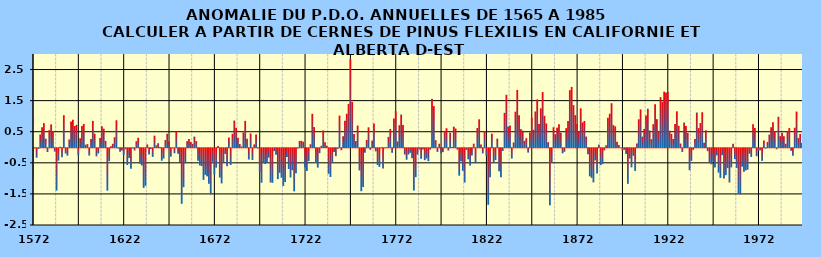
| Category | PDO |
|---|---|
| 1572.0 | -1.008 |
| 1573.0 | -0.007 |
| 1574.0 | -0.303 |
| 1575.0 | -0.023 |
| 1576.0 | 0.412 |
| 1577.0 | 0.647 |
| 1578.0 | 0.775 |
| 1579.0 | 0.276 |
| 1580.0 | -0.122 |
| 1581.0 | 0.549 |
| 1582.0 | 0.735 |
| 1583.0 | 0.515 |
| 1584.0 | -0.107 |
| 1585.0 | -1.361 |
| 1586.0 | -0.398 |
| 1587.0 | 0.017 |
| 1588.0 | -0.288 |
| 1589.0 | 1.031 |
| 1590.0 | -0.167 |
| 1591.0 | -0.238 |
| 1592.0 | 0.25 |
| 1593.0 | 0.826 |
| 1594.0 | 0.888 |
| 1595.0 | 0.685 |
| 1596.0 | 0.722 |
| 1597.0 | -0.222 |
| 1598.0 | 0.29 |
| 1599.0 | 0.682 |
| 1600.0 | 0.752 |
| 1601.0 | 0.083 |
| 1602.0 | 0.101 |
| 1603.0 | -0.235 |
| 1604.0 | 0.263 |
| 1605.0 | 0.85 |
| 1606.0 | 0.437 |
| 1607.0 | -0.259 |
| 1608.0 | -0.166 |
| 1609.0 | 0.302 |
| 1610.0 | 0.674 |
| 1611.0 | 0.599 |
| 1612.0 | 0.205 |
| 1613.0 | -1.363 |
| 1614.0 | -0.412 |
| 1615.0 | 0.032 |
| 1616.0 | 0.112 |
| 1617.0 | 0.323 |
| 1618.0 | 0.869 |
| 1619.0 | -0.014 |
| 1620.0 | -0.113 |
| 1621.0 | -0.074 |
| 1622.0 | -0.217 |
| 1623.0 | -0.03 |
| 1624.0 | -0.539 |
| 1625.0 | -0.31 |
| 1626.0 | -0.657 |
| 1627.0 | -0.009 |
| 1628.0 | -0.071 |
| 1629.0 | 0.196 |
| 1630.0 | 0.306 |
| 1631.0 | -0.501 |
| 1632.0 | -0.555 |
| 1633.0 | -1.275 |
| 1634.0 | -1.207 |
| 1635.0 | 0.092 |
| 1636.0 | -0.203 |
| 1637.0 | -0.024 |
| 1638.0 | -0.278 |
| 1639.0 | 0.375 |
| 1640.0 | 0.062 |
| 1641.0 | 0.13 |
| 1642.0 | 0.01 |
| 1643.0 | -0.402 |
| 1644.0 | -0.331 |
| 1645.0 | 0.231 |
| 1646.0 | 0.435 |
| 1647.0 | 0.192 |
| 1648.0 | -0.27 |
| 1649.0 | -0.006 |
| 1650.0 | -0.161 |
| 1651.0 | 0.496 |
| 1652.0 | -0.177 |
| 1653.0 | -0.454 |
| 1654.0 | -1.786 |
| 1655.0 | -1.252 |
| 1656.0 | -0.479 |
| 1657.0 | 0.195 |
| 1658.0 | 0.265 |
| 1659.0 | 0.171 |
| 1660.0 | 0.109 |
| 1661.0 | 0.345 |
| 1662.0 | 0.199 |
| 1663.0 | -0.403 |
| 1664.0 | -0.553 |
| 1665.0 | -0.573 |
| 1666.0 | -1.018 |
| 1667.0 | -0.854 |
| 1668.0 | -0.902 |
| 1669.0 | -1.14 |
| 1670.0 | -1.484 |
| 1671.0 | -0.435 |
| 1672.0 | -0.846 |
| 1673.0 | -0.625 |
| 1674.0 | 0.045 |
| 1675.0 | -0.942 |
| 1676.0 | -1.13 |
| 1677.0 | -0.445 |
| 1678.0 | -0.184 |
| 1679.0 | -0.577 |
| 1680.0 | 0.313 |
| 1681.0 | -0.537 |
| 1682.0 | 0.435 |
| 1683.0 | 0.86 |
| 1684.0 | 0.622 |
| 1685.0 | 0.302 |
| 1686.0 | 0.103 |
| 1687.0 | 0.025 |
| 1688.0 | 0.475 |
| 1689.0 | 0.85 |
| 1690.0 | 0.278 |
| 1691.0 | -0.362 |
| 1692.0 | 0.446 |
| 1693.0 | -0.376 |
| 1694.0 | 0.093 |
| 1695.0 | 0.411 |
| 1696.0 | -0.009 |
| 1697.0 | -0.762 |
| 1698.0 | -1.11 |
| 1699.0 | -0.443 |
| 1700.0 | -0.508 |
| 1701.0 | -0.459 |
| 1702.0 | -0.3 |
| 1703.0 | -1.099 |
| 1704.0 | -1.111 |
| 1705.0 | -0.093 |
| 1706.0 | -0.208 |
| 1707.0 | -0.991 |
| 1708.0 | -0.791 |
| 1709.0 | -0.947 |
| 1710.0 | -1.215 |
| 1711.0 | -1.085 |
| 1712.0 | -0.283 |
| 1713.0 | -0.666 |
| 1714.0 | -0.941 |
| 1715.0 | -0.707 |
| 1716.0 | -1.385 |
| 1717.0 | -0.807 |
| 1718.0 | -0.012 |
| 1719.0 | 0.205 |
| 1720.0 | 0.206 |
| 1721.0 | 0.18 |
| 1722.0 | -0.611 |
| 1723.0 | -0.732 |
| 1724.0 | -0.412 |
| 1725.0 | 0.097 |
| 1726.0 | 1.077 |
| 1727.0 | 0.65 |
| 1728.0 | -0.467 |
| 1729.0 | -0.622 |
| 1730.0 | -0.156 |
| 1731.0 | 0.05 |
| 1732.0 | 0.543 |
| 1733.0 | 0.159 |
| 1734.0 | 0.052 |
| 1735.0 | -0.821 |
| 1736.0 | -0.923 |
| 1737.0 | -0.443 |
| 1738.0 | -0.121 |
| 1739.0 | -0.254 |
| 1740.0 | -0.021 |
| 1741.0 | 1.019 |
| 1742.0 | -0.062 |
| 1743.0 | 0.355 |
| 1744.0 | 0.854 |
| 1745.0 | 1.078 |
| 1746.0 | 1.395 |
| 1747.0 | 2.832 |
| 1748.0 | 1.46 |
| 1749.0 | 0.424 |
| 1750.0 | 0.199 |
| 1751.0 | 0.7 |
| 1752.0 | -0.713 |
| 1753.0 | -1.382 |
| 1754.0 | -1.249 |
| 1755.0 | -0.143 |
| 1756.0 | 0.235 |
| 1757.0 | 0.642 |
| 1758.0 | -0.051 |
| 1759.0 | 0.217 |
| 1760.0 | 0.762 |
| 1761.0 | -0.099 |
| 1762.0 | -0.54 |
| 1763.0 | -0.601 |
| 1764.0 | -0.006 |
| 1765.0 | -0.648 |
| 1766.0 | -0.005 |
| 1767.0 | 0.004 |
| 1768.0 | 0.335 |
| 1769.0 | 0.591 |
| 1770.0 | -0.147 |
| 1771.0 | 0.927 |
| 1772.0 | 1.159 |
| 1773.0 | 0.186 |
| 1774.0 | 0.71 |
| 1775.0 | 1.054 |
| 1776.0 | 0.713 |
| 1777.0 | -0.2 |
| 1778.0 | -0.368 |
| 1779.0 | -0.203 |
| 1780.0 | -0.148 |
| 1781.0 | -0.32 |
| 1782.0 | -1.36 |
| 1783.0 | -0.926 |
| 1784.0 | -0.204 |
| 1785.0 | -0.042 |
| 1786.0 | -0.339 |
| 1787.0 | -0.04 |
| 1788.0 | -0.382 |
| 1789.0 | -0.329 |
| 1790.0 | -0.414 |
| 1791.0 | -0.044 |
| 1792.0 | 1.563 |
| 1793.0 | 1.325 |
| 1794.0 | 0.228 |
| 1795.0 | -0.117 |
| 1796.0 | 0.114 |
| 1797.0 | -0.171 |
| 1798.0 | -0.124 |
| 1799.0 | 0.527 |
| 1800.0 | 0.612 |
| 1801.0 | -0.073 |
| 1802.0 | 0.469 |
| 1803.0 | 0.007 |
| 1804.0 | 0.665 |
| 1805.0 | 0.605 |
| 1806.0 | -0.045 |
| 1807.0 | -0.882 |
| 1808.0 | -0.415 |
| 1809.0 | -0.726 |
| 1810.0 | -1.103 |
| 1811.0 | -0.052 |
| 1812.0 | -0.355 |
| 1813.0 | -0.557 |
| 1814.0 | -0.236 |
| 1815.0 | 0.116 |
| 1816.0 | -0.48 |
| 1817.0 | 0.622 |
| 1818.0 | 0.9 |
| 1819.0 | 0.09 |
| 1820.0 | -0.163 |
| 1821.0 | 0.523 |
| 1822.0 | -0.237 |
| 1823.0 | -1.818 |
| 1824.0 | -0.931 |
| 1825.0 | 0.437 |
| 1826.0 | -0.449 |
| 1827.0 | -0.379 |
| 1828.0 | 0.279 |
| 1829.0 | -0.741 |
| 1830.0 | -0.935 |
| 1831.0 | -0.087 |
| 1832.0 | 1.108 |
| 1833.0 | 1.689 |
| 1834.0 | 0.668 |
| 1835.0 | 0.703 |
| 1836.0 | -0.331 |
| 1837.0 | 0.155 |
| 1838.0 | 1.147 |
| 1839.0 | 1.844 |
| 1840.0 | 1.032 |
| 1841.0 | 0.583 |
| 1842.0 | 0.535 |
| 1843.0 | 0.208 |
| 1844.0 | 0.292 |
| 1845.0 | -0.139 |
| 1846.0 | 0.479 |
| 1847.0 | 0.952 |
| 1848.0 | 0.564 |
| 1849.0 | 1.152 |
| 1850.0 | 1.54 |
| 1851.0 | 0.748 |
| 1852.0 | 1.252 |
| 1853.0 | 1.774 |
| 1854.0 | 1.012 |
| 1855.0 | 0.769 |
| 1856.0 | 0.165 |
| 1857.0 | -1.835 |
| 1858.0 | -0.445 |
| 1859.0 | 0.643 |
| 1860.0 | 0.42 |
| 1861.0 | 0.632 |
| 1862.0 | 0.742 |
| 1863.0 | 0.472 |
| 1864.0 | -0.162 |
| 1865.0 | -0.114 |
| 1866.0 | 0.616 |
| 1867.0 | 0.848 |
| 1868.0 | 1.836 |
| 1869.0 | 1.94 |
| 1870.0 | 1.356 |
| 1871.0 | 1.033 |
| 1872.0 | 0.751 |
| 1873.0 | 0.508 |
| 1874.0 | 1.252 |
| 1875.0 | 0.798 |
| 1876.0 | 0.847 |
| 1877.0 | 0.345 |
| 1878.0 | -0.192 |
| 1879.0 | -0.903 |
| 1880.0 | -0.952 |
| 1881.0 | -1.098 |
| 1882.0 | -0.389 |
| 1883.0 | -0.812 |
| 1884.0 | 0.085 |
| 1885.0 | -0.543 |
| 1886.0 | -0.51 |
| 1887.0 | -0.067 |
| 1888.0 | 0.063 |
| 1889.0 | 0.948 |
| 1890.0 | 1.079 |
| 1891.0 | 1.416 |
| 1892.0 | 0.712 |
| 1893.0 | 0.673 |
| 1894.0 | 0.175 |
| 1895.0 | 0.073 |
| 1896.0 | 0 |
| 1897.0 | -0.068 |
| 1898.0 | -0.052 |
| 1899.0 | -0.184 |
| 1900.0 | -1.143 |
| 1901.0 | -0.331 |
| 1902.0 | -0.614 |
| 1903.0 | -0.243 |
| 1904.0 | -0.728 |
| 1905.0 | 0.125 |
| 1906.0 | 0.9 |
| 1907.0 | 1.217 |
| 1908.0 | 0.343 |
| 1909.0 | 0.593 |
| 1910.0 | 1.024 |
| 1911.0 | 1.24 |
| 1912.0 | 0.54 |
| 1913.0 | 0.261 |
| 1914.0 | 0.742 |
| 1915.0 | 1.384 |
| 1916.0 | 0.904 |
| 1917.0 | 0.501 |
| 1918.0 | 1.612 |
| 1919.0 | 1.462 |
| 1920.0 | 1.79 |
| 1921.0 | 1.76 |
| 1922.0 | 1.781 |
| 1923.0 | 0.535 |
| 1924.0 | 0.431 |
| 1925.0 | 0.265 |
| 1926.0 | 0.75 |
| 1927.0 | 1.158 |
| 1928.0 | 0.69 |
| 1929.0 | 0.121 |
| 1930.0 | -0.12 |
| 1931.0 | 0.795 |
| 1932.0 | 0.683 |
| 1933.0 | 0.461 |
| 1934.0 | -0.707 |
| 1935.0 | -0.404 |
| 1936.0 | -0.051 |
| 1937.0 | 0.266 |
| 1938.0 | 1.118 |
| 1939.0 | 0.617 |
| 1940.0 | 0.779 |
| 1941.0 | 1.126 |
| 1942.0 | 0.149 |
| 1943.0 | 0.545 |
| 1944.0 | -0.093 |
| 1945.0 | -0.457 |
| 1946.0 | -0.515 |
| 1947.0 | -0.409 |
| 1948.0 | -0.622 |
| 1949.0 | -0.229 |
| 1950.0 | -0.784 |
| 1951.0 | -0.953 |
| 1952.0 | -0.221 |
| 1953.0 | -0.969 |
| 1954.0 | -0.863 |
| 1955.0 | -0.638 |
| 1956.0 | -1.099 |
| 1957.0 | -0.614 |
| 1958.0 | 0.117 |
| 1959.0 | -0.347 |
| 1960.0 | -0.632 |
| 1961.0 | -1.46 |
| 1962.0 | -1.482 |
| 1963.0 | -0.591 |
| 1964.0 | -0.752 |
| 1965.0 | -0.711 |
| 1966.0 | -0.689 |
| 1967.0 | -0.174 |
| 1968.0 | -0.279 |
| 1969.0 | 0.737 |
| 1970.0 | 0.62 |
| 1971.0 | -0.256 |
| 1972.0 | -0.087 |
| 1973.0 | -0.065 |
| 1974.0 | -0.405 |
| 1975.0 | 0.219 |
| 1976.0 | -0.014 |
| 1977.0 | 0.169 |
| 1978.0 | 0.408 |
| 1979.0 | 0.644 |
| 1980.0 | 0.807 |
| 1981.0 | 0.523 |
| 1982.0 | -0.032 |
| 1983.0 | 0.983 |
| 1984.0 | 0.357 |
| 1985.0 | 0.464 |
| 1986.0 | 0.356 |
| 1987.0 | 0.113 |
| 1988.0 | 0.506 |
| 1989.0 | 0.617 |
| 1990.0 | -0.08 |
| 1991.0 | -0.244 |
| 1992.0 | 0.629 |
| 1993.0 | 1.15 |
| 1994.0 | 0.293 |
| 1995.0 | 0.427 |
| 1996.0 | 0.139 |